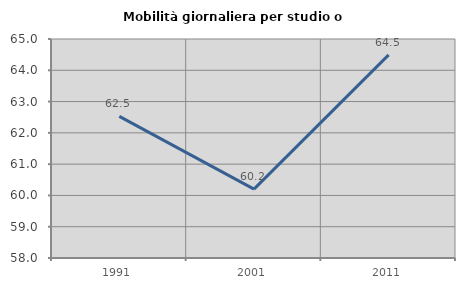
| Category | Mobilità giornaliera per studio o lavoro |
|---|---|
| 1991.0 | 62.525 |
| 2001.0 | 60.203 |
| 2011.0 | 64.493 |